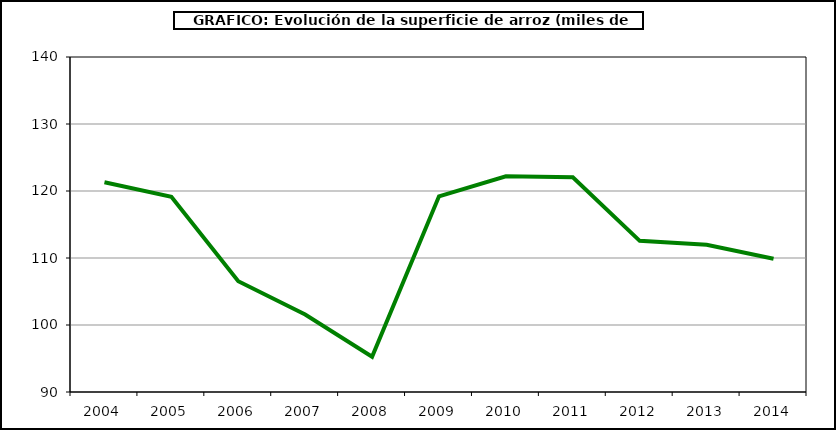
| Category | Superficie |
|---|---|
| 2004.0 | 121.3 |
| 2005.0 | 119.15 |
| 2006.0 | 106.535 |
| 2007.0 | 101.565 |
| 2008.0 | 95.27 |
| 2009.0 | 119.202 |
| 2010.0 | 122.184 |
| 2011.0 | 122.058 |
| 2012.0 | 112.557 |
| 2013.0 | 111.984 |
| 2014.0 | 109.889 |